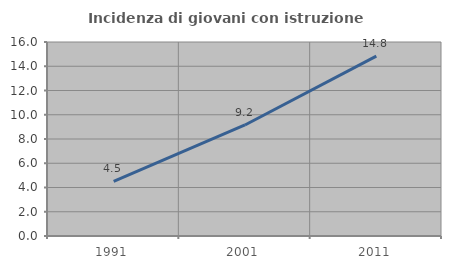
| Category | Incidenza di giovani con istruzione universitaria |
|---|---|
| 1991.0 | 4.505 |
| 2001.0 | 9.155 |
| 2011.0 | 14.841 |